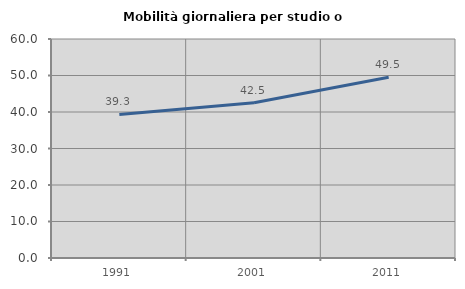
| Category | Mobilità giornaliera per studio o lavoro |
|---|---|
| 1991.0 | 39.332 |
| 2001.0 | 42.519 |
| 2011.0 | 49.533 |